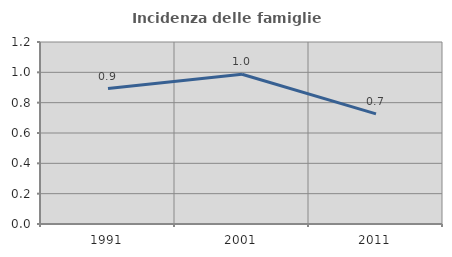
| Category | Incidenza delle famiglie numerose |
|---|---|
| 1991.0 | 0.893 |
| 2001.0 | 0.988 |
| 2011.0 | 0.726 |